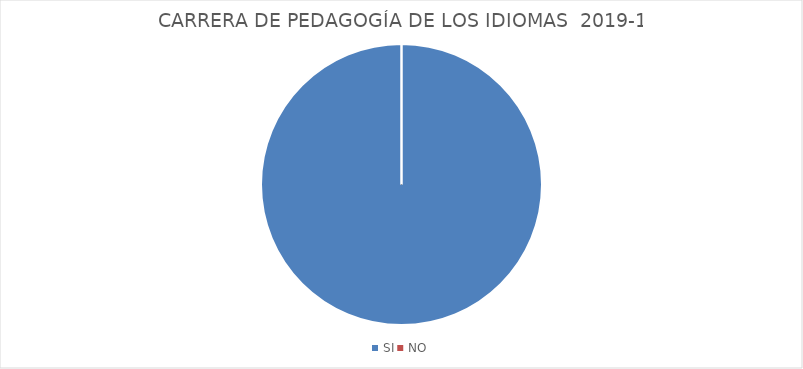
| Category | Series 0 |
|---|---|
| SI | 77 |
| NO | 0 |